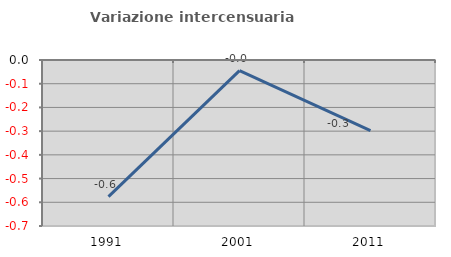
| Category | Variazione intercensuaria annua |
|---|---|
| 1991.0 | -0.576 |
| 2001.0 | -0.045 |
| 2011.0 | -0.297 |